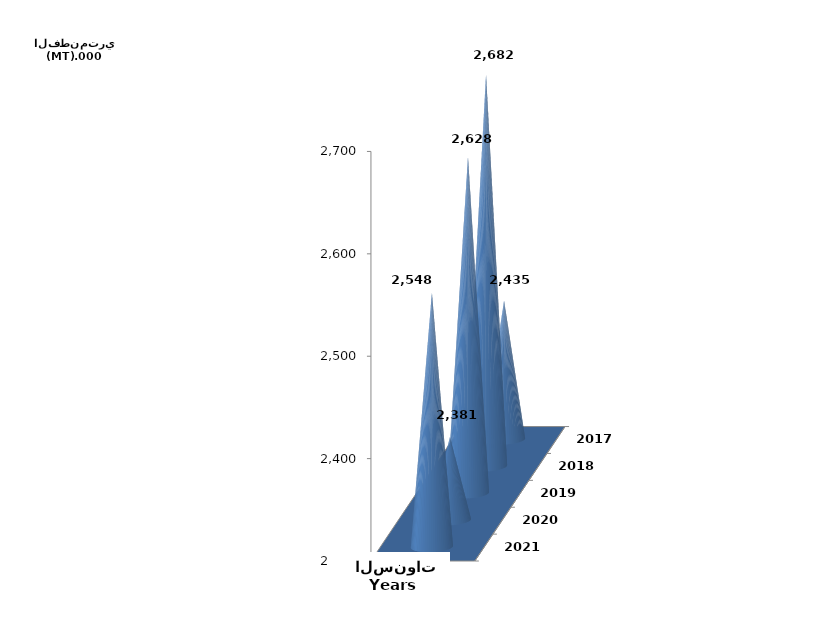
| Category | Series 0 |
|---|---|
| 2017 | 2435155.083 |
| 2018 | 2682336.913 |
| 2019 | 2627645.697 |
| 2020 | 2380916.081 |
| 2021 | 2548034 |